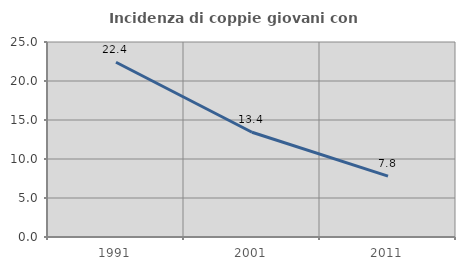
| Category | Incidenza di coppie giovani con figli |
|---|---|
| 1991.0 | 22.405 |
| 2001.0 | 13.425 |
| 2011.0 | 7.805 |